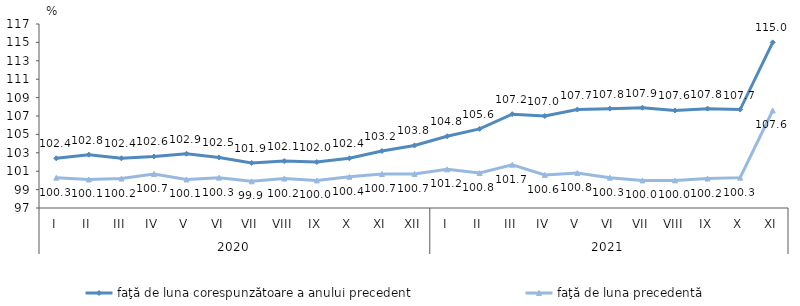
| Category | faţă de luna corespunzătoare a anului precedent | faţă de luna precedentă   |
|---|---|---|
| 0 | 102.4 | 100.3 |
| 1 | 102.8 | 100.1 |
| 2 | 102.4 | 100.2 |
| 3 | 102.6 | 100.7 |
| 4 | 102.9 | 100.1 |
| 5 | 102.5 | 100.3 |
| 6 | 101.9 | 99.9 |
| 7 | 102.1 | 100.2 |
| 8 | 102 | 100 |
| 9 | 102.4 | 100.4 |
| 10 | 103.2 | 100.7 |
| 11 | 103.8 | 100.7 |
| 12 | 104.8 | 101.2 |
| 13 | 105.6 | 100.8 |
| 14 | 107.2 | 101.7 |
| 15 | 107 | 100.6 |
| 16 | 107.7 | 100.8 |
| 17 | 107.8 | 100.3 |
| 18 | 107.9 | 100 |
| 19 | 107.6 | 100 |
| 20 | 107.8 | 100.2 |
| 21 | 107.7 | 100.3 |
| 22 | 115 | 107.6 |